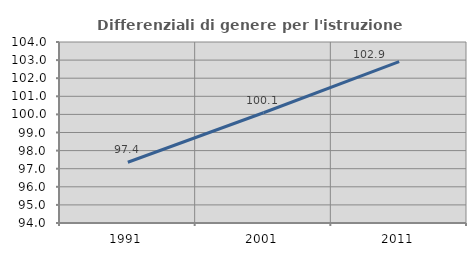
| Category | Differenziali di genere per l'istruzione superiore |
|---|---|
| 1991.0 | 97.357 |
| 2001.0 | 100.09 |
| 2011.0 | 102.92 |